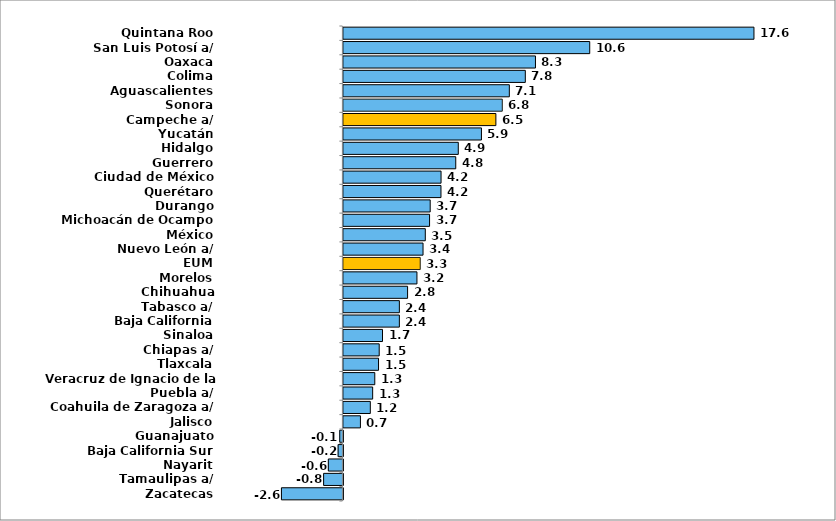
| Category | Series 0 |
|---|---|
| Zacatecas | -2.64 |
| Tamaulipas a/ | -0.828 |
| Nayarit | -0.625 |
| Baja California Sur | -0.205 |
| Guanajuato | -0.136 |
| Jalisco | 0.732 |
| Coahuila de Zaragoza a/ | 1.156 |
| Puebla a/ | 1.257 |
| Veracruz de Ignacio de la Llave a/ | 1.348 |
| Tlaxcala | 1.51 |
| Chiapas a/ | 1.538 |
| Sinaloa | 1.68 |
| Baja California | 2.404 |
| Tabasco a/ | 2.404 |
| Chihuahua | 2.757 |
| Morelos | 3.159 |
| EUM | 3.3 |
| Nuevo León a/ | 3.421 |
| México | 3.518 |
| Michoacán de Ocampo | 3.701 |
| Durango | 3.728 |
| Querétaro | 4.191 |
| Ciudad de México | 4.195 |
| Guerrero | 4.826 |
| Hidalgo | 4.935 |
| Yucatán | 5.93 |
| Campeche a/ | 6.55 |
| Sonora | 6.825 |
| Aguascalientes | 7.128 |
| Colima | 7.815 |
| Oaxaca | 8.25 |
| San Luis Potosí a/ | 10.581 |
| Quintana Roo | 17.636 |